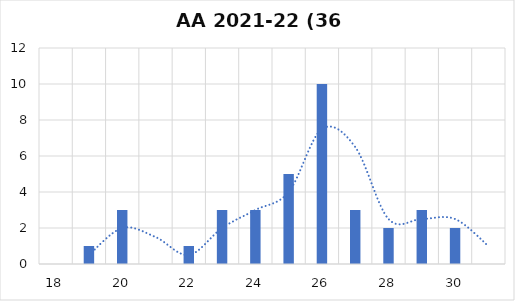
| Category | Series 0 |
|---|---|
| 18 | 0 |
| 19 | 1 |
| 20 | 3 |
| 21 | 0 |
| 22 | 1 |
| 23 | 3 |
| 24 | 3 |
| 25 | 5 |
| 26 | 10 |
| 27 | 3 |
| 28 | 2 |
| 29 | 3 |
| 30 | 2 |
| 30 e lode | 0 |